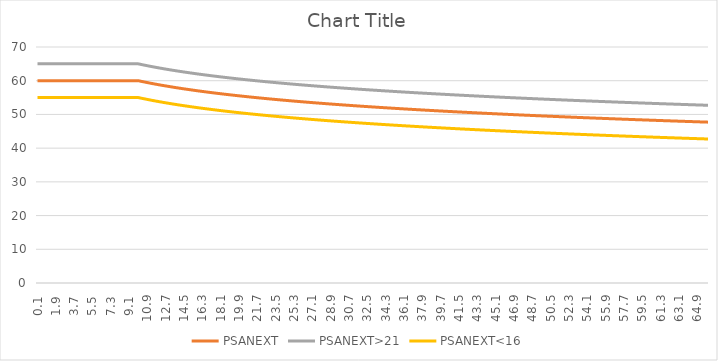
| Category | PSANEXT | PSANEXT>21 | PSANEXT<16 |
|---|---|---|---|
| 0.1 | 60 | 65 | 55 |
| 0.2 | 60 | 65 | 55 |
| 0.3 | 60 | 65 | 55 |
| 0.4 | 60 | 65 | 55 |
| 0.5 | 60 | 65 | 55 |
| 0.6 | 60 | 65 | 55 |
| 0.7 | 60 | 65 | 55 |
| 0.8 | 60 | 65 | 55 |
| 0.9 | 60 | 65 | 55 |
| 1.0 | 60 | 65 | 55 |
| 1.1 | 60 | 65 | 55 |
| 1.2 | 60 | 65 | 55 |
| 1.3 | 60 | 65 | 55 |
| 1.4 | 60 | 65 | 55 |
| 1.5 | 60 | 65 | 55 |
| 1.6 | 60 | 65 | 55 |
| 1.7 | 60 | 65 | 55 |
| 1.8 | 60 | 65 | 55 |
| 1.9 | 60 | 65 | 55 |
| 2.0 | 60 | 65 | 55 |
| 2.1 | 60 | 65 | 55 |
| 2.2 | 60 | 65 | 55 |
| 2.3 | 60 | 65 | 55 |
| 2.4 | 60 | 65 | 55 |
| 2.5 | 60 | 65 | 55 |
| 2.6 | 60 | 65 | 55 |
| 2.7 | 60 | 65 | 55 |
| 2.8 | 60 | 65 | 55 |
| 2.9 | 60 | 65 | 55 |
| 3.0 | 60 | 65 | 55 |
| 3.1 | 60 | 65 | 55 |
| 3.2 | 60 | 65 | 55 |
| 3.3 | 60 | 65 | 55 |
| 3.4 | 60 | 65 | 55 |
| 3.5 | 60 | 65 | 55 |
| 3.6 | 60 | 65 | 55 |
| 3.7 | 60 | 65 | 55 |
| 3.8 | 60 | 65 | 55 |
| 3.9 | 60 | 65 | 55 |
| 4.0 | 60 | 65 | 55 |
| 4.1 | 60 | 65 | 55 |
| 4.2 | 60 | 65 | 55 |
| 4.3 | 60 | 65 | 55 |
| 4.4 | 60 | 65 | 55 |
| 4.5 | 60 | 65 | 55 |
| 4.6 | 60 | 65 | 55 |
| 4.7 | 60 | 65 | 55 |
| 4.8 | 60 | 65 | 55 |
| 4.9 | 60 | 65 | 55 |
| 5.0 | 60 | 65 | 55 |
| 5.1 | 60 | 65 | 55 |
| 5.2 | 60 | 65 | 55 |
| 5.3 | 60 | 65 | 55 |
| 5.4 | 60 | 65 | 55 |
| 5.5 | 60 | 65 | 55 |
| 5.6 | 60 | 65 | 55 |
| 5.7 | 60 | 65 | 55 |
| 5.8 | 60 | 65 | 55 |
| 5.9 | 60 | 65 | 55 |
| 6.0 | 60 | 65 | 55 |
| 6.1 | 60 | 65 | 55 |
| 6.2 | 60 | 65 | 55 |
| 6.3 | 60 | 65 | 55 |
| 6.4 | 60 | 65 | 55 |
| 6.5 | 60 | 65 | 55 |
| 6.6 | 60 | 65 | 55 |
| 6.7 | 60 | 65 | 55 |
| 6.8 | 60 | 65 | 55 |
| 6.9 | 60 | 65 | 55 |
| 7.0 | 60 | 65 | 55 |
| 7.1 | 60 | 65 | 55 |
| 7.2 | 60 | 65 | 55 |
| 7.3 | 60 | 65 | 55 |
| 7.4 | 60 | 65 | 55 |
| 7.5 | 60 | 65 | 55 |
| 7.6 | 60 | 65 | 55 |
| 7.7 | 60 | 65 | 55 |
| 7.8 | 60 | 65 | 55 |
| 7.9 | 60 | 65 | 55 |
| 8.0 | 60 | 65 | 55 |
| 8.1 | 60 | 65 | 55 |
| 8.2 | 60 | 65 | 55 |
| 8.3 | 60 | 65 | 55 |
| 8.4 | 60 | 65 | 55 |
| 8.5 | 60 | 65 | 55 |
| 8.6 | 60 | 65 | 55 |
| 8.7 | 60 | 65 | 55 |
| 8.8 | 60 | 65 | 55 |
| 8.9 | 60 | 65 | 55 |
| 9.0 | 60 | 65 | 55 |
| 9.1 | 60 | 65 | 55 |
| 9.2 | 60 | 65 | 55 |
| 9.3 | 60 | 65 | 55 |
| 9.4 | 60 | 65 | 55 |
| 9.5 | 60 | 65 | 55 |
| 9.6 | 60 | 65 | 55 |
| 9.7 | 60 | 65 | 55 |
| 9.8 | 60 | 65 | 55 |
| 9.9 | 60 | 65 | 55 |
| 10.0 | 60 | 65 | 55 |
| 10.1 | 59.935 | 64.935 | 54.935 |
| 10.2 | 59.871 | 64.871 | 54.871 |
| 10.3 | 59.807 | 64.807 | 54.807 |
| 10.4 | 59.744 | 64.744 | 54.744 |
| 10.5 | 59.682 | 64.682 | 54.682 |
| 10.6 | 59.62 | 64.62 | 54.62 |
| 10.7 | 59.559 | 64.559 | 54.559 |
| 10.8 | 59.499 | 64.499 | 54.499 |
| 10.9 | 59.439 | 64.439 | 54.439 |
| 11.0 | 59.379 | 64.379 | 54.379 |
| 11.1 | 59.32 | 64.32 | 54.32 |
| 11.2 | 59.262 | 64.262 | 54.262 |
| 11.3 | 59.204 | 64.204 | 54.204 |
| 11.4 | 59.146 | 64.146 | 54.146 |
| 11.5 | 59.09 | 64.09 | 54.09 |
| 11.6 | 59.033 | 64.033 | 54.033 |
| 11.7 | 58.977 | 63.977 | 53.977 |
| 11.8 | 58.922 | 63.922 | 53.922 |
| 11.9 | 58.867 | 63.867 | 53.867 |
| 12.0 | 58.812 | 63.812 | 53.812 |
| 12.1 | 58.758 | 63.758 | 53.758 |
| 12.2 | 58.705 | 63.705 | 53.705 |
| 12.3 | 58.651 | 63.651 | 53.651 |
| 12.4 | 58.599 | 63.599 | 53.599 |
| 12.5 | 58.546 | 63.546 | 53.546 |
| 12.6 | 58.494 | 63.494 | 53.494 |
| 12.7 | 58.443 | 63.443 | 53.443 |
| 12.8 | 58.392 | 63.392 | 53.392 |
| 12.9 | 58.341 | 63.341 | 53.341 |
| 13.0 | 58.291 | 63.291 | 53.291 |
| 13.1 | 58.241 | 63.241 | 53.241 |
| 13.2 | 58.191 | 63.191 | 53.191 |
| 13.3 | 58.142 | 63.142 | 53.142 |
| 13.4 | 58.093 | 63.093 | 53.093 |
| 13.5 | 58.045 | 63.045 | 53.045 |
| 13.6 | 57.997 | 62.997 | 52.997 |
| 13.7 | 57.949 | 62.949 | 52.949 |
| 13.8 | 57.902 | 62.902 | 52.902 |
| 13.9 | 57.855 | 62.855 | 52.855 |
| 14.0 | 57.808 | 62.808 | 52.808 |
| 14.1 | 57.762 | 62.762 | 52.762 |
| 14.2 | 57.716 | 62.716 | 52.716 |
| 14.3 | 57.67 | 62.67 | 52.67 |
| 14.4 | 57.625 | 62.625 | 52.625 |
| 14.5 | 57.579 | 62.579 | 52.579 |
| 14.6 | 57.535 | 62.535 | 52.535 |
| 14.7 | 57.49 | 62.49 | 52.49 |
| 14.8 | 57.446 | 62.446 | 52.446 |
| 14.9 | 57.402 | 62.402 | 52.402 |
| 15.0 | 57.359 | 62.359 | 52.359 |
| 15.1 | 57.315 | 62.315 | 52.315 |
| 15.2 | 57.272 | 62.272 | 52.272 |
| 15.3 | 57.23 | 62.23 | 52.23 |
| 15.4 | 57.187 | 62.187 | 52.187 |
| 15.5 | 57.145 | 62.145 | 52.145 |
| 15.6 | 57.103 | 62.103 | 52.103 |
| 15.7 | 57.062 | 62.062 | 52.062 |
| 15.8 | 57.02 | 62.02 | 52.02 |
| 15.9 | 56.979 | 61.979 | 51.979 |
| 16.0 | 56.938 | 61.938 | 51.938 |
| 16.1 | 56.898 | 61.898 | 51.898 |
| 16.2 | 56.857 | 61.857 | 51.857 |
| 16.3 | 56.817 | 61.817 | 51.817 |
| 16.4 | 56.777 | 61.777 | 51.777 |
| 16.5 | 56.738 | 61.738 | 51.738 |
| 16.6 | 56.698 | 61.698 | 51.698 |
| 16.7 | 56.659 | 61.659 | 51.659 |
| 16.8 | 56.62 | 61.62 | 51.62 |
| 16.9 | 56.582 | 61.582 | 51.582 |
| 17.0 | 56.543 | 61.543 | 51.543 |
| 17.1 | 56.505 | 61.505 | 51.505 |
| 17.2 | 56.467 | 61.467 | 51.467 |
| 17.3 | 56.429 | 61.429 | 51.429 |
| 17.4 | 56.392 | 61.392 | 51.392 |
| 17.5 | 56.354 | 61.354 | 51.354 |
| 17.6 | 56.317 | 61.317 | 51.317 |
| 17.7 | 56.28 | 61.28 | 51.28 |
| 17.8 | 56.244 | 61.244 | 51.244 |
| 17.9 | 56.207 | 61.207 | 51.207 |
| 18.0 | 56.171 | 61.171 | 51.171 |
| 18.1 | 56.135 | 61.135 | 51.135 |
| 18.2 | 56.099 | 61.099 | 51.099 |
| 18.3 | 56.063 | 61.063 | 51.063 |
| 18.4 | 56.028 | 61.028 | 51.028 |
| 18.5 | 55.992 | 60.992 | 50.992 |
| 18.6 | 55.957 | 60.957 | 50.957 |
| 18.7 | 55.922 | 60.922 | 50.922 |
| 18.8 | 55.888 | 60.888 | 50.888 |
| 18.9 | 55.853 | 60.853 | 50.853 |
| 19.0 | 55.819 | 60.819 | 50.819 |
| 19.1 | 55.784 | 60.784 | 50.784 |
| 19.2 | 55.75 | 60.75 | 50.75 |
| 19.3 | 55.717 | 60.717 | 50.717 |
| 19.4 | 55.683 | 60.683 | 50.683 |
| 19.5 | 55.649 | 60.649 | 50.649 |
| 19.6 | 55.616 | 60.616 | 50.616 |
| 19.7 | 55.583 | 60.583 | 50.583 |
| 19.8 | 55.55 | 60.55 | 50.55 |
| 19.9 | 55.517 | 60.517 | 50.517 |
| 20.0 | 55.485 | 60.485 | 50.485 |
| 20.1 | 55.452 | 60.452 | 50.452 |
| 20.2 | 55.42 | 60.42 | 50.42 |
| 20.3 | 55.388 | 60.388 | 50.388 |
| 20.4 | 55.356 | 60.356 | 50.356 |
| 20.5 | 55.324 | 60.324 | 50.324 |
| 20.6 | 55.292 | 60.292 | 50.292 |
| 20.7 | 55.26 | 60.26 | 50.26 |
| 20.8 | 55.229 | 60.229 | 50.229 |
| 20.9 | 55.198 | 60.198 | 50.198 |
| 21.0 | 55.167 | 60.167 | 50.167 |
| 21.1 | 55.136 | 60.136 | 50.136 |
| 21.2 | 55.105 | 60.105 | 50.105 |
| 21.3 | 55.074 | 60.074 | 50.074 |
| 21.4 | 55.044 | 60.044 | 50.044 |
| 21.5 | 55.013 | 60.013 | 50.013 |
| 21.6 | 54.983 | 59.983 | 49.983 |
| 21.7 | 54.953 | 59.953 | 49.953 |
| 21.8 | 54.923 | 59.923 | 49.923 |
| 21.9 | 54.893 | 59.893 | 49.893 |
| 22.0 | 54.864 | 59.864 | 49.864 |
| 22.1 | 54.834 | 59.834 | 49.834 |
| 22.2 | 54.805 | 59.805 | 49.805 |
| 22.3 | 54.775 | 59.775 | 49.775 |
| 22.4 | 54.746 | 59.746 | 49.746 |
| 22.5 | 54.717 | 59.717 | 49.717 |
| 22.6 | 54.688 | 59.688 | 49.688 |
| 22.7 | 54.66 | 59.66 | 49.66 |
| 22.8 | 54.631 | 59.631 | 49.631 |
| 22.9 | 54.602 | 59.602 | 49.602 |
| 23.0 | 54.574 | 59.574 | 49.574 |
| 23.1 | 54.546 | 59.546 | 49.546 |
| 23.2 | 54.518 | 59.518 | 49.518 |
| 23.3 | 54.49 | 59.49 | 49.49 |
| 23.4 | 54.462 | 59.462 | 49.462 |
| 23.5 | 54.434 | 59.434 | 49.434 |
| 23.6 | 54.406 | 59.406 | 49.406 |
| 23.7 | 54.379 | 59.379 | 49.379 |
| 23.8 | 54.351 | 59.351 | 49.351 |
| 23.9 | 54.324 | 59.324 | 49.324 |
| 24.0 | 54.297 | 59.297 | 49.297 |
| 24.1 | 54.27 | 59.27 | 49.27 |
| 24.2 | 54.243 | 59.243 | 49.243 |
| 24.3 | 54.216 | 59.216 | 49.216 |
| 24.4 | 54.189 | 59.189 | 49.189 |
| 24.5 | 54.163 | 59.163 | 49.163 |
| 24.6 | 54.136 | 59.136 | 49.136 |
| 24.7 | 54.11 | 59.11 | 49.11 |
| 24.8000000000001 | 54.083 | 59.083 | 49.083 |
| 24.9 | 54.057 | 59.057 | 49.057 |
| 25.0 | 54.031 | 59.031 | 49.031 |
| 25.1000000000001 | 54.005 | 59.005 | 49.005 |
| 25.2 | 53.979 | 58.979 | 48.979 |
| 25.3000000000001 | 53.953 | 58.953 | 48.953 |
| 25.4000000000001 | 53.927 | 58.927 | 48.927 |
| 25.5000000000001 | 53.902 | 58.902 | 48.902 |
| 25.6000000000001 | 53.876 | 58.876 | 48.876 |
| 25.7000000000001 | 53.851 | 58.851 | 48.851 |
| 25.8000000000001 | 53.826 | 58.826 | 48.826 |
| 25.9000000000001 | 53.801 | 58.801 | 48.801 |
| 26.0000000000001 | 53.775 | 58.775 | 48.775 |
| 26.1000000000001 | 53.75 | 58.75 | 48.75 |
| 26.2000000000001 | 53.725 | 58.725 | 48.725 |
| 26.3000000000001 | 53.701 | 58.701 | 48.701 |
| 26.4000000000001 | 53.676 | 58.676 | 48.676 |
| 26.5000000000001 | 53.651 | 58.651 | 48.651 |
| 26.6000000000001 | 53.627 | 58.627 | 48.627 |
| 26.7000000000001 | 53.602 | 58.602 | 48.602 |
| 26.8000000000001 | 53.578 | 58.578 | 48.578 |
| 26.9000000000001 | 53.554 | 58.554 | 48.554 |
| 27.0000000000001 | 53.53 | 58.53 | 48.53 |
| 27.1000000000001 | 53.505 | 58.505 | 48.505 |
| 27.2000000000001 | 53.481 | 58.481 | 48.481 |
| 27.3000000000001 | 53.458 | 58.458 | 48.458 |
| 27.4000000000001 | 53.434 | 58.434 | 48.434 |
| 27.5000000000001 | 53.41 | 58.41 | 48.41 |
| 27.6000000000001 | 53.386 | 58.386 | 48.386 |
| 27.7000000000001 | 53.363 | 58.363 | 48.363 |
| 27.8000000000001 | 53.339 | 58.339 | 48.339 |
| 27.9000000000001 | 53.316 | 58.316 | 48.316 |
| 28.0000000000001 | 53.293 | 58.293 | 48.293 |
| 28.1000000000001 | 53.269 | 58.269 | 48.269 |
| 28.2000000000001 | 53.246 | 58.246 | 48.246 |
| 28.3000000000001 | 53.223 | 58.223 | 48.223 |
| 28.4000000000001 | 53.2 | 58.2 | 48.2 |
| 28.5000000000001 | 53.177 | 58.177 | 48.177 |
| 28.6000000000001 | 53.155 | 58.155 | 48.155 |
| 28.7000000000001 | 53.132 | 58.132 | 48.132 |
| 28.8000000000001 | 53.109 | 58.109 | 48.109 |
| 28.9000000000001 | 53.087 | 58.087 | 48.087 |
| 29.0000000000001 | 53.064 | 58.064 | 48.064 |
| 29.1000000000001 | 53.042 | 58.042 | 48.042 |
| 29.2000000000001 | 53.019 | 58.019 | 48.019 |
| 29.3000000000001 | 52.997 | 57.997 | 47.997 |
| 29.4000000000001 | 52.975 | 57.975 | 47.975 |
| 29.5000000000001 | 52.953 | 57.953 | 47.953 |
| 29.6000000000001 | 52.931 | 57.931 | 47.931 |
| 29.7000000000001 | 52.909 | 57.909 | 47.909 |
| 29.8000000000001 | 52.887 | 57.887 | 47.887 |
| 29.9000000000001 | 52.865 | 57.865 | 47.865 |
| 30.0000000000001 | 52.843 | 57.843 | 47.843 |
| 30.1000000000001 | 52.822 | 57.822 | 47.822 |
| 30.2000000000001 | 52.8 | 57.8 | 47.8 |
| 30.3000000000001 | 52.778 | 57.778 | 47.778 |
| 30.4000000000001 | 52.757 | 57.757 | 47.757 |
| 30.5000000000001 | 52.736 | 57.736 | 47.736 |
| 30.6000000000001 | 52.714 | 57.714 | 47.714 |
| 30.7000000000001 | 52.693 | 57.693 | 47.693 |
| 30.8000000000001 | 52.672 | 57.672 | 47.672 |
| 30.9000000000001 | 52.651 | 57.651 | 47.651 |
| 31.0000000000001 | 52.63 | 57.63 | 47.63 |
| 31.1000000000001 | 52.609 | 57.609 | 47.609 |
| 31.2000000000001 | 52.588 | 57.588 | 47.588 |
| 31.3000000000001 | 52.567 | 57.567 | 47.567 |
| 31.4000000000001 | 52.546 | 57.546 | 47.546 |
| 31.5000000000001 | 52.525 | 57.525 | 47.525 |
| 31.6000000000001 | 52.505 | 57.505 | 47.505 |
| 31.7000000000001 | 52.484 | 57.484 | 47.484 |
| 31.8000000000001 | 52.464 | 57.464 | 47.464 |
| 31.9000000000001 | 52.443 | 57.443 | 47.443 |
| 32.0000000000001 | 52.423 | 57.423 | 47.423 |
| 32.1000000000002 | 52.402 | 57.402 | 47.402 |
| 32.2000000000002 | 52.382 | 57.382 | 47.382 |
| 32.3000000000002 | 52.362 | 57.362 | 47.362 |
| 32.4000000000002 | 52.342 | 57.342 | 47.342 |
| 32.5000000000002 | 52.322 | 57.322 | 47.322 |
| 32.6000000000002 | 52.302 | 57.302 | 47.302 |
| 32.7000000000002 | 52.282 | 57.282 | 47.282 |
| 32.8000000000002 | 52.262 | 57.262 | 47.262 |
| 32.9000000000002 | 52.242 | 57.242 | 47.242 |
| 33.0000000000002 | 52.222 | 57.222 | 47.222 |
| 33.1000000000002 | 52.203 | 57.203 | 47.203 |
| 33.2000000000002 | 52.183 | 57.183 | 47.183 |
| 33.3000000000002 | 52.163 | 57.163 | 47.163 |
| 33.4000000000002 | 52.144 | 57.144 | 47.144 |
| 33.5000000000002 | 52.124 | 57.124 | 47.124 |
| 33.6000000000002 | 52.105 | 57.105 | 47.105 |
| 33.7000000000002 | 52.086 | 57.086 | 47.086 |
| 33.8000000000002 | 52.066 | 57.066 | 47.066 |
| 33.9000000000002 | 52.047 | 57.047 | 47.047 |
| 34.0000000000002 | 52.028 | 57.028 | 47.028 |
| 34.1000000000002 | 52.009 | 57.009 | 47.009 |
| 34.2000000000002 | 51.99 | 56.99 | 46.99 |
| 34.3000000000002 | 51.971 | 56.971 | 46.971 |
| 34.4000000000002 | 51.952 | 56.952 | 46.952 |
| 34.5000000000002 | 51.933 | 56.933 | 46.933 |
| 34.6000000000002 | 51.914 | 56.914 | 46.914 |
| 34.7000000000002 | 51.895 | 56.895 | 46.895 |
| 34.8000000000002 | 51.876 | 56.876 | 46.876 |
| 34.9000000000002 | 51.858 | 56.858 | 46.858 |
| 35.0000000000002 | 51.839 | 56.839 | 46.839 |
| 35.1000000000002 | 51.82 | 56.82 | 46.82 |
| 35.2000000000002 | 51.802 | 56.802 | 46.802 |
| 35.3000000000002 | 51.783 | 56.783 | 46.783 |
| 35.4000000000002 | 51.765 | 56.765 | 46.765 |
| 35.5000000000002 | 51.747 | 56.747 | 46.747 |
| 35.6000000000002 | 51.728 | 56.728 | 46.728 |
| 35.7000000000002 | 51.71 | 56.71 | 46.71 |
| 35.8000000000002 | 51.692 | 56.692 | 46.692 |
| 35.9000000000002 | 51.674 | 56.674 | 46.674 |
| 36.0000000000002 | 51.655 | 56.655 | 46.655 |
| 36.1000000000002 | 51.637 | 56.637 | 46.637 |
| 36.2000000000002 | 51.619 | 56.619 | 46.619 |
| 36.3000000000002 | 51.601 | 56.601 | 46.601 |
| 36.4000000000002 | 51.583 | 56.583 | 46.583 |
| 36.5000000000002 | 51.566 | 56.566 | 46.566 |
| 36.6000000000002 | 51.548 | 56.548 | 46.548 |
| 36.7000000000002 | 51.53 | 56.53 | 46.53 |
| 36.8000000000002 | 51.512 | 56.512 | 46.512 |
| 36.9000000000002 | 51.495 | 56.495 | 46.495 |
| 37.0000000000002 | 51.477 | 56.477 | 46.477 |
| 37.1000000000002 | 51.459 | 56.459 | 46.459 |
| 37.2000000000002 | 51.442 | 56.442 | 46.442 |
| 37.3000000000002 | 51.424 | 56.424 | 46.424 |
| 37.4000000000002 | 51.407 | 56.407 | 46.407 |
| 37.5000000000002 | 51.39 | 56.39 | 46.39 |
| 37.6000000000002 | 51.372 | 56.372 | 46.372 |
| 37.7000000000002 | 51.355 | 56.355 | 46.355 |
| 37.8000000000002 | 51.338 | 56.338 | 46.338 |
| 37.9000000000002 | 51.32 | 56.32 | 46.32 |
| 38.0000000000002 | 51.303 | 56.303 | 46.303 |
| 38.1000000000002 | 51.286 | 56.286 | 46.286 |
| 38.2000000000002 | 51.269 | 56.269 | 46.269 |
| 38.3000000000002 | 51.252 | 56.252 | 46.252 |
| 38.4000000000002 | 51.235 | 56.235 | 46.235 |
| 38.5000000000002 | 51.218 | 56.218 | 46.218 |
| 38.6000000000002 | 51.201 | 56.201 | 46.201 |
| 38.7000000000002 | 51.184 | 56.184 | 46.184 |
| 38.8000000000002 | 51.168 | 56.168 | 46.168 |
| 38.9000000000002 | 51.151 | 56.151 | 46.151 |
| 39.0000000000002 | 51.134 | 56.134 | 46.134 |
| 39.1000000000003 | 51.117 | 56.117 | 46.117 |
| 39.2000000000003 | 51.101 | 56.101 | 46.101 |
| 39.3000000000003 | 51.084 | 56.084 | 46.084 |
| 39.4000000000003 | 51.068 | 56.068 | 46.068 |
| 39.5000000000003 | 51.051 | 56.051 | 46.051 |
| 39.6000000000003 | 51.035 | 56.035 | 46.035 |
| 39.7000000000003 | 51.018 | 56.018 | 46.018 |
| 39.8000000000003 | 51.002 | 56.002 | 46.002 |
| 39.9000000000003 | 50.985 | 55.985 | 45.985 |
| 40.0000000000003 | 50.969 | 55.969 | 45.969 |
| 40.1000000000003 | 50.953 | 55.953 | 45.953 |
| 40.2000000000003 | 50.937 | 55.937 | 45.937 |
| 40.3000000000003 | 50.92 | 55.92 | 45.92 |
| 40.4000000000003 | 50.904 | 55.904 | 45.904 |
| 40.5000000000003 | 50.888 | 55.888 | 45.888 |
| 40.6000000000003 | 50.872 | 55.872 | 45.872 |
| 40.7000000000003 | 50.856 | 55.856 | 45.856 |
| 40.8000000000003 | 50.84 | 55.84 | 45.84 |
| 40.9000000000003 | 50.824 | 55.824 | 45.824 |
| 41.0000000000003 | 50.808 | 55.808 | 45.808 |
| 41.1000000000003 | 50.792 | 55.792 | 45.792 |
| 41.2000000000003 | 50.777 | 55.777 | 45.777 |
| 41.3000000000003 | 50.761 | 55.761 | 45.761 |
| 41.4000000000003 | 50.745 | 55.745 | 45.745 |
| 41.5000000000003 | 50.729 | 55.729 | 45.729 |
| 41.6000000000003 | 50.714 | 55.714 | 45.714 |
| 41.7000000000003 | 50.698 | 55.698 | 45.698 |
| 41.8000000000003 | 50.682 | 55.682 | 45.682 |
| 41.9000000000003 | 50.667 | 55.667 | 45.667 |
| 42.0000000000003 | 50.651 | 55.651 | 45.651 |
| 42.1000000000003 | 50.636 | 55.636 | 45.636 |
| 42.2000000000003 | 50.62 | 55.62 | 45.62 |
| 42.3000000000003 | 50.605 | 55.605 | 45.605 |
| 42.4000000000003 | 50.59 | 55.59 | 45.59 |
| 42.5000000000003 | 50.574 | 55.574 | 45.574 |
| 42.6000000000003 | 50.559 | 55.559 | 45.559 |
| 42.7000000000003 | 50.544 | 55.544 | 45.544 |
| 42.8000000000003 | 50.528 | 55.528 | 45.528 |
| 42.9000000000003 | 50.513 | 55.513 | 45.513 |
| 43.0000000000003 | 50.498 | 55.498 | 45.498 |
| 43.1000000000003 | 50.483 | 55.483 | 45.483 |
| 43.2000000000003 | 50.468 | 55.468 | 45.468 |
| 43.3000000000003 | 50.453 | 55.453 | 45.453 |
| 43.4000000000003 | 50.438 | 55.438 | 45.438 |
| 43.5000000000003 | 50.423 | 55.423 | 45.423 |
| 43.6000000000003 | 50.408 | 55.408 | 45.408 |
| 43.7000000000003 | 50.393 | 55.393 | 45.393 |
| 43.8000000000003 | 50.378 | 55.378 | 45.378 |
| 43.9000000000003 | 50.363 | 55.363 | 45.363 |
| 44.0000000000003 | 50.348 | 55.348 | 45.348 |
| 44.1000000000003 | 50.333 | 55.333 | 45.333 |
| 44.2000000000003 | 50.319 | 55.319 | 45.319 |
| 44.3000000000003 | 50.304 | 55.304 | 45.304 |
| 44.4000000000003 | 50.289 | 55.289 | 45.289 |
| 44.5000000000003 | 50.275 | 55.275 | 45.275 |
| 44.6000000000003 | 50.26 | 55.26 | 45.26 |
| 44.7000000000003 | 50.245 | 55.245 | 45.245 |
| 44.8000000000003 | 50.231 | 55.231 | 45.231 |
| 44.9000000000003 | 50.216 | 55.216 | 45.216 |
| 45.0000000000003 | 50.202 | 55.202 | 45.202 |
| 45.1000000000003 | 50.187 | 55.187 | 45.187 |
| 45.2000000000003 | 50.173 | 55.173 | 45.173 |
| 45.3000000000003 | 50.159 | 55.159 | 45.159 |
| 45.4000000000003 | 50.144 | 55.144 | 45.144 |
| 45.5000000000003 | 50.13 | 55.13 | 45.13 |
| 45.6000000000003 | 50.116 | 55.116 | 45.116 |
| 45.7000000000003 | 50.101 | 55.101 | 45.101 |
| 45.8000000000003 | 50.087 | 55.087 | 45.087 |
| 45.9000000000003 | 50.073 | 55.073 | 45.073 |
| 46.0000000000003 | 50.059 | 55.059 | 45.059 |
| 46.1000000000003 | 50.044 | 55.044 | 45.044 |
| 46.2000000000004 | 50.03 | 55.03 | 45.03 |
| 46.3000000000004 | 50.016 | 55.016 | 45.016 |
| 46.4000000000004 | 50.002 | 55.002 | 45.002 |
| 46.5000000000004 | 49.988 | 54.988 | 44.988 |
| 46.6000000000004 | 49.974 | 54.974 | 44.974 |
| 46.7000000000004 | 49.96 | 54.96 | 44.96 |
| 46.8000000000004 | 49.946 | 54.946 | 44.946 |
| 46.9000000000004 | 49.932 | 54.932 | 44.932 |
| 47.0000000000004 | 49.919 | 54.919 | 44.919 |
| 47.1000000000004 | 49.905 | 54.905 | 44.905 |
| 47.2000000000004 | 49.891 | 54.891 | 44.891 |
| 47.3000000000004 | 49.877 | 54.877 | 44.877 |
| 47.4000000000004 | 49.863 | 54.863 | 44.863 |
| 47.5000000000004 | 49.85 | 54.85 | 44.85 |
| 47.6000000000004 | 49.836 | 54.836 | 44.836 |
| 47.7000000000004 | 49.822 | 54.822 | 44.822 |
| 47.8000000000004 | 49.809 | 54.809 | 44.809 |
| 47.9000000000004 | 49.795 | 54.795 | 44.795 |
| 48.0000000000004 | 49.781 | 54.781 | 44.781 |
| 48.1000000000004 | 49.768 | 54.768 | 44.768 |
| 48.2000000000004 | 49.754 | 54.754 | 44.754 |
| 48.3000000000004 | 49.741 | 54.741 | 44.741 |
| 48.4000000000004 | 49.727 | 54.727 | 44.727 |
| 48.5000000000004 | 49.714 | 54.714 | 44.714 |
| 48.6000000000004 | 49.7 | 54.7 | 44.7 |
| 48.7000000000004 | 49.687 | 54.687 | 44.687 |
| 48.8000000000004 | 49.674 | 54.674 | 44.674 |
| 48.9000000000004 | 49.66 | 54.66 | 44.66 |
| 49.0000000000004 | 49.647 | 54.647 | 44.647 |
| 49.1000000000004 | 49.634 | 54.634 | 44.634 |
| 49.2000000000004 | 49.621 | 54.621 | 44.621 |
| 49.3000000000004 | 49.607 | 54.607 | 44.607 |
| 49.4000000000004 | 49.594 | 54.594 | 44.594 |
| 49.5000000000004 | 49.581 | 54.581 | 44.581 |
| 49.6000000000004 | 49.568 | 54.568 | 44.568 |
| 49.7000000000004 | 49.555 | 54.555 | 44.555 |
| 49.8000000000004 | 49.542 | 54.542 | 44.542 |
| 49.9000000000004 | 49.528 | 54.528 | 44.528 |
| 50.0000000000004 | 49.515 | 54.515 | 44.515 |
| 50.1000000000004 | 49.502 | 54.502 | 44.502 |
| 50.2000000000004 | 49.489 | 54.489 | 44.489 |
| 50.3000000000004 | 49.476 | 54.476 | 44.476 |
| 50.4000000000004 | 49.464 | 54.464 | 44.464 |
| 50.5000000000004 | 49.451 | 54.451 | 44.451 |
| 50.6000000000004 | 49.438 | 54.438 | 44.438 |
| 50.7000000000004 | 49.425 | 54.425 | 44.425 |
| 50.8000000000004 | 49.412 | 54.412 | 44.412 |
| 50.9000000000004 | 49.399 | 54.399 | 44.399 |
| 51.0000000000004 | 49.386 | 54.386 | 44.386 |
| 51.1000000000004 | 49.374 | 54.374 | 44.374 |
| 51.2000000000004 | 49.361 | 54.361 | 44.361 |
| 51.3000000000004 | 49.348 | 54.348 | 44.348 |
| 51.4000000000004 | 49.336 | 54.336 | 44.336 |
| 51.5000000000004 | 49.323 | 54.323 | 44.323 |
| 51.6000000000004 | 49.31 | 54.31 | 44.31 |
| 51.7000000000004 | 49.298 | 54.298 | 44.298 |
| 51.8000000000004 | 49.285 | 54.285 | 44.285 |
| 51.9000000000004 | 49.272 | 54.272 | 44.272 |
| 52.0000000000004 | 49.26 | 54.26 | 44.26 |
| 52.1000000000004 | 49.247 | 54.247 | 44.247 |
| 52.2000000000004 | 49.235 | 54.235 | 44.235 |
| 52.3000000000004 | 49.222 | 54.222 | 44.222 |
| 52.4000000000004 | 49.21 | 54.21 | 44.21 |
| 52.5000000000004 | 49.198 | 54.198 | 44.198 |
| 52.6000000000004 | 49.185 | 54.185 | 44.185 |
| 52.7000000000004 | 49.173 | 54.173 | 44.173 |
| 52.8000000000004 | 49.16 | 54.16 | 44.16 |
| 52.9000000000004 | 49.148 | 54.148 | 44.148 |
| 53.0000000000004 | 49.136 | 54.136 | 44.136 |
| 53.1000000000004 | 49.124 | 54.124 | 44.124 |
| 53.2000000000005 | 49.111 | 54.111 | 44.111 |
| 53.3000000000005 | 49.099 | 54.099 | 44.099 |
| 53.4000000000005 | 49.087 | 54.087 | 44.087 |
| 53.5000000000005 | 49.075 | 54.075 | 44.075 |
| 53.6000000000005 | 49.063 | 54.063 | 44.063 |
| 53.7000000000005 | 49.05 | 54.05 | 44.05 |
| 53.8000000000005 | 49.038 | 54.038 | 44.038 |
| 53.9000000000005 | 49.026 | 54.026 | 44.026 |
| 54.0000000000005 | 49.014 | 54.014 | 44.014 |
| 54.1000000000005 | 49.002 | 54.002 | 44.002 |
| 54.2000000000005 | 48.99 | 53.99 | 43.99 |
| 54.3000000000005 | 48.978 | 53.978 | 43.978 |
| 54.4000000000005 | 48.966 | 53.966 | 43.966 |
| 54.5000000000005 | 48.954 | 53.954 | 43.954 |
| 54.6000000000005 | 48.942 | 53.942 | 43.942 |
| 54.7000000000005 | 48.93 | 53.93 | 43.93 |
| 54.8000000000005 | 48.918 | 53.918 | 43.918 |
| 54.9000000000005 | 48.906 | 53.906 | 43.906 |
| 55.0000000000005 | 48.895 | 53.895 | 43.895 |
| 55.1000000000005 | 48.883 | 53.883 | 43.883 |
| 55.2000000000005 | 48.871 | 53.871 | 43.871 |
| 55.3000000000005 | 48.859 | 53.859 | 43.859 |
| 55.4000000000005 | 48.847 | 53.847 | 43.847 |
| 55.5000000000005 | 48.836 | 53.836 | 43.836 |
| 55.6000000000005 | 48.824 | 53.824 | 43.824 |
| 55.7000000000005 | 48.812 | 53.812 | 43.812 |
| 55.8000000000005 | 48.8 | 53.8 | 43.8 |
| 55.9000000000005 | 48.789 | 53.789 | 43.789 |
| 56.0000000000005 | 48.777 | 53.777 | 43.777 |
| 56.1000000000005 | 48.766 | 53.766 | 43.766 |
| 56.2000000000005 | 48.754 | 53.754 | 43.754 |
| 56.3000000000005 | 48.742 | 53.742 | 43.742 |
| 56.4000000000005 | 48.731 | 53.731 | 43.731 |
| 56.5000000000005 | 48.719 | 53.719 | 43.719 |
| 56.6000000000005 | 48.708 | 53.708 | 43.708 |
| 56.7000000000005 | 48.696 | 53.696 | 43.696 |
| 56.8000000000005 | 48.685 | 53.685 | 43.685 |
| 56.9000000000005 | 48.673 | 53.673 | 43.673 |
| 57.0000000000005 | 48.662 | 53.662 | 43.662 |
| 57.1000000000005 | 48.65 | 53.65 | 43.65 |
| 57.2000000000005 | 48.639 | 53.639 | 43.639 |
| 57.3000000000005 | 48.628 | 53.628 | 43.628 |
| 57.4000000000005 | 48.616 | 53.616 | 43.616 |
| 57.5000000000005 | 48.605 | 53.605 | 43.605 |
| 57.6000000000005 | 48.594 | 53.594 | 43.594 |
| 57.7000000000005 | 48.582 | 53.582 | 43.582 |
| 57.8000000000005 | 48.571 | 53.571 | 43.571 |
| 57.9000000000005 | 48.56 | 53.56 | 43.56 |
| 58.0000000000005 | 48.549 | 53.549 | 43.549 |
| 58.1000000000005 | 48.537 | 53.537 | 43.537 |
| 58.2000000000005 | 48.526 | 53.526 | 43.526 |
| 58.3000000000006 | 48.515 | 53.515 | 43.515 |
| 58.4000000000005 | 48.504 | 53.504 | 43.504 |
| 58.5000000000005 | 48.493 | 53.493 | 43.493 |
| 58.6000000000005 | 48.482 | 53.482 | 43.482 |
| 58.7000000000005 | 48.47 | 53.47 | 43.47 |
| 58.8000000000006 | 48.459 | 53.459 | 43.459 |
| 58.9000000000005 | 48.448 | 53.448 | 43.448 |
| 59.0000000000006 | 48.437 | 53.437 | 43.437 |
| 59.1000000000006 | 48.426 | 53.426 | 43.426 |
| 59.2000000000006 | 48.415 | 53.415 | 43.415 |
| 59.3000000000006 | 48.404 | 53.404 | 43.404 |
| 59.4000000000006 | 48.393 | 53.393 | 43.393 |
| 59.5000000000006 | 48.382 | 53.382 | 43.382 |
| 59.6000000000006 | 48.371 | 53.371 | 43.371 |
| 59.7000000000006 | 48.36 | 53.36 | 43.36 |
| 59.8000000000006 | 48.349 | 53.349 | 43.349 |
| 59.9000000000006 | 48.339 | 53.339 | 43.339 |
| 60.0000000000006 | 48.328 | 53.328 | 43.328 |
| 60.1000000000006 | 48.317 | 53.317 | 43.317 |
| 60.2000000000006 | 48.306 | 53.306 | 43.306 |
| 60.3000000000006 | 48.295 | 53.295 | 43.295 |
| 60.4000000000006 | 48.284 | 53.284 | 43.284 |
| 60.5000000000006 | 48.274 | 53.274 | 43.274 |
| 60.6000000000006 | 48.263 | 53.263 | 43.263 |
| 60.7000000000006 | 48.252 | 53.252 | 43.252 |
| 60.8000000000006 | 48.241 | 53.241 | 43.241 |
| 60.9000000000006 | 48.231 | 53.231 | 43.231 |
| 61.0000000000006 | 48.22 | 53.22 | 43.22 |
| 61.1000000000006 | 48.209 | 53.209 | 43.209 |
| 61.2000000000006 | 48.199 | 53.199 | 43.199 |
| 61.3000000000006 | 48.188 | 53.188 | 43.188 |
| 61.4000000000006 | 48.177 | 53.177 | 43.177 |
| 61.5000000000006 | 48.167 | 53.167 | 43.167 |
| 61.6000000000006 | 48.156 | 53.156 | 43.156 |
| 61.7000000000006 | 48.146 | 53.146 | 43.146 |
| 61.8000000000006 | 48.135 | 53.135 | 43.135 |
| 61.9000000000006 | 48.125 | 53.125 | 43.125 |
| 62.0000000000006 | 48.114 | 53.114 | 43.114 |
| 62.1000000000006 | 48.104 | 53.104 | 43.104 |
| 62.2000000000006 | 48.093 | 53.093 | 43.093 |
| 62.3000000000006 | 48.083 | 53.083 | 43.083 |
| 62.4000000000006 | 48.072 | 53.072 | 43.072 |
| 62.5000000000006 | 48.062 | 53.062 | 43.062 |
| 62.6000000000006 | 48.051 | 53.051 | 43.051 |
| 62.7000000000006 | 48.041 | 53.041 | 43.041 |
| 62.8000000000006 | 48.031 | 53.031 | 43.031 |
| 62.9000000000006 | 48.02 | 53.02 | 43.02 |
| 63.0000000000006 | 48.01 | 53.01 | 43.01 |
| 63.1000000000006 | 48 | 53 | 43 |
| 63.2000000000006 | 47.989 | 52.989 | 42.989 |
| 63.3000000000006 | 47.979 | 52.979 | 42.979 |
| 63.4000000000006 | 47.969 | 52.969 | 42.969 |
| 63.5000000000006 | 47.958 | 52.958 | 42.958 |
| 63.6000000000006 | 47.948 | 52.948 | 42.948 |
| 63.7000000000006 | 47.938 | 52.938 | 42.938 |
| 63.8000000000006 | 47.928 | 52.928 | 42.928 |
| 63.9000000000006 | 47.917 | 52.917 | 42.917 |
| 64.0000000000006 | 47.907 | 52.907 | 42.907 |
| 64.1000000000006 | 47.897 | 52.897 | 42.897 |
| 64.2000000000006 | 47.887 | 52.887 | 42.887 |
| 64.3000000000006 | 47.877 | 52.877 | 42.877 |
| 64.4000000000006 | 47.867 | 52.867 | 42.867 |
| 64.5000000000006 | 47.857 | 52.857 | 42.857 |
| 64.6000000000006 | 47.847 | 52.847 | 42.847 |
| 64.7000000000006 | 47.836 | 52.836 | 42.836 |
| 64.8000000000006 | 47.826 | 52.826 | 42.826 |
| 64.9000000000006 | 47.816 | 52.816 | 42.816 |
| 65.0000000000006 | 47.806 | 52.806 | 42.806 |
| 65.1000000000006 | 47.796 | 52.796 | 42.796 |
| 65.2000000000006 | 47.786 | 52.786 | 42.786 |
| 65.3000000000006 | 47.776 | 52.776 | 42.776 |
| 65.4000000000006 | 47.766 | 52.766 | 42.766 |
| 65.5000000000006 | 47.756 | 52.756 | 42.756 |
| 65.6000000000006 | 47.746 | 52.746 | 42.746 |
| 65.7000000000007 | 47.737 | 52.737 | 42.737 |
| 65.8000000000007 | 47.727 | 52.727 | 42.727 |
| 65.9000000000007 | 47.717 | 52.717 | 42.717 |
| 66.0000000000007 | 47.707 | 52.707 | 42.707 |